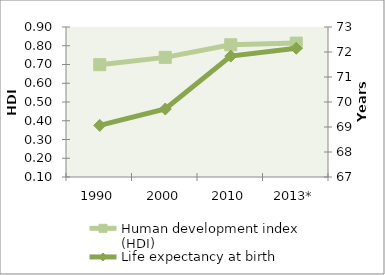
| Category | Human development index (HDI) |
|---|---|
| 1990 | 0.699 |
| 2000 | 0.738 |
| 2010 | 0.805 |
| 2013* | 0.814 |